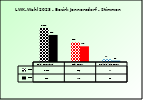
| Category | 2018 | 2023 |
|---|---|---|
| Bgld. Bauernbund | 1022 | 812 |
| SPÖ Bauern | 586 | 471 |
| Freiheitliche Bauern | 77 | 38 |